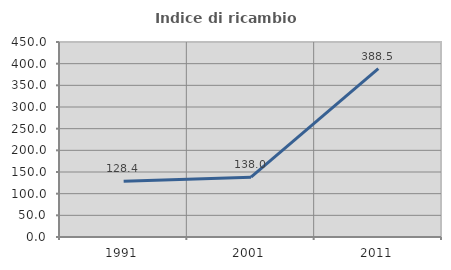
| Category | Indice di ricambio occupazionale  |
|---|---|
| 1991.0 | 128.446 |
| 2001.0 | 138 |
| 2011.0 | 388.514 |